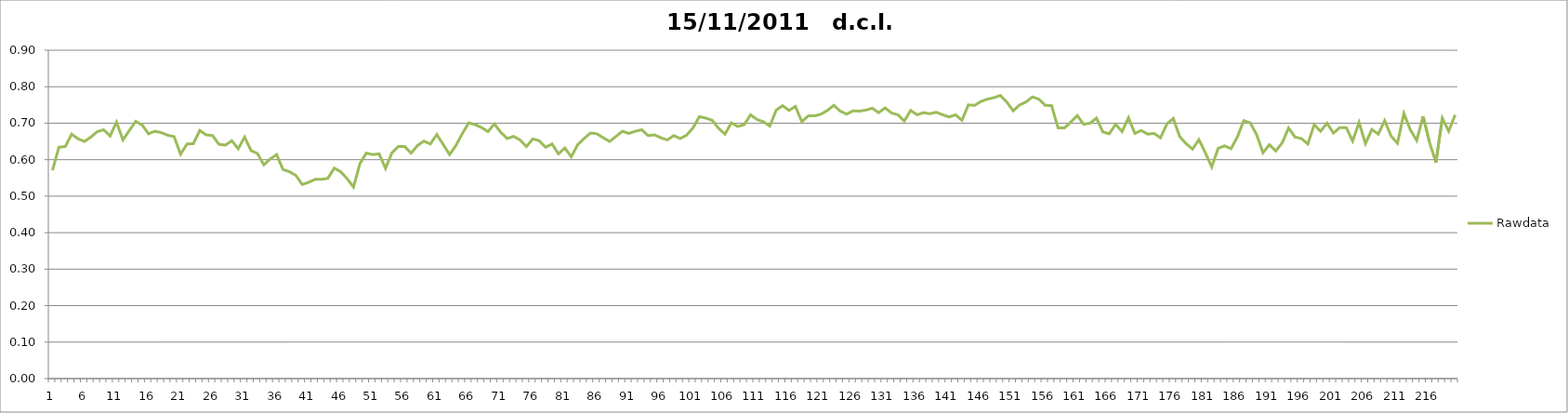
| Category | Rawdata |
|---|---|
| 0 | 0.571 |
| 1 | 0.634 |
| 2 | 0.636 |
| 3 | 0.67 |
| 4 | 0.657 |
| 5 | 0.65 |
| 6 | 0.662 |
| 7 | 0.677 |
| 8 | 0.682 |
| 9 | 0.665 |
| 10 | 0.703 |
| 11 | 0.654 |
| 12 | 0.68 |
| 13 | 0.705 |
| 14 | 0.695 |
| 15 | 0.671 |
| 16 | 0.678 |
| 17 | 0.674 |
| 18 | 0.667 |
| 19 | 0.663 |
| 20 | 0.615 |
| 21 | 0.643 |
| 22 | 0.644 |
| 23 | 0.68 |
| 24 | 0.668 |
| 25 | 0.666 |
| 26 | 0.642 |
| 27 | 0.64 |
| 28 | 0.652 |
| 29 | 0.63 |
| 30 | 0.662 |
| 31 | 0.625 |
| 32 | 0.617 |
| 33 | 0.586 |
| 34 | 0.602 |
| 35 | 0.614 |
| 36 | 0.573 |
| 37 | 0.567 |
| 38 | 0.557 |
| 39 | 0.532 |
| 40 | 0.538 |
| 41 | 0.546 |
| 42 | 0.546 |
| 43 | 0.549 |
| 44 | 0.577 |
| 45 | 0.567 |
| 46 | 0.548 |
| 47 | 0.525 |
| 48 | 0.589 |
| 49 | 0.618 |
| 50 | 0.614 |
| 51 | 0.616 |
| 52 | 0.576 |
| 53 | 0.619 |
| 54 | 0.636 |
| 55 | 0.636 |
| 56 | 0.618 |
| 57 | 0.639 |
| 58 | 0.651 |
| 59 | 0.643 |
| 60 | 0.669 |
| 61 | 0.642 |
| 62 | 0.614 |
| 63 | 0.639 |
| 64 | 0.672 |
| 65 | 0.701 |
| 66 | 0.696 |
| 67 | 0.688 |
| 68 | 0.677 |
| 69 | 0.698 |
| 70 | 0.675 |
| 71 | 0.658 |
| 72 | 0.664 |
| 73 | 0.654 |
| 74 | 0.636 |
| 75 | 0.657 |
| 76 | 0.652 |
| 77 | 0.634 |
| 78 | 0.643 |
| 79 | 0.616 |
| 80 | 0.632 |
| 81 | 0.608 |
| 82 | 0.641 |
| 83 | 0.658 |
| 84 | 0.673 |
| 85 | 0.671 |
| 86 | 0.66 |
| 87 | 0.65 |
| 88 | 0.664 |
| 89 | 0.678 |
| 90 | 0.672 |
| 91 | 0.678 |
| 92 | 0.682 |
| 93 | 0.666 |
| 94 | 0.668 |
| 95 | 0.66 |
| 96 | 0.654 |
| 97 | 0.666 |
| 98 | 0.658 |
| 99 | 0.667 |
| 100 | 0.687 |
| 101 | 0.718 |
| 102 | 0.714 |
| 103 | 0.708 |
| 104 | 0.686 |
| 105 | 0.67 |
| 106 | 0.701 |
| 107 | 0.691 |
| 108 | 0.696 |
| 109 | 0.723 |
| 110 | 0.71 |
| 111 | 0.704 |
| 112 | 0.692 |
| 113 | 0.736 |
| 114 | 0.748 |
| 115 | 0.735 |
| 116 | 0.746 |
| 117 | 0.704 |
| 118 | 0.72 |
| 119 | 0.72 |
| 120 | 0.725 |
| 121 | 0.735 |
| 122 | 0.749 |
| 123 | 0.733 |
| 124 | 0.725 |
| 125 | 0.734 |
| 126 | 0.733 |
| 127 | 0.736 |
| 128 | 0.741 |
| 129 | 0.729 |
| 130 | 0.742 |
| 131 | 0.728 |
| 132 | 0.723 |
| 133 | 0.706 |
| 134 | 0.735 |
| 135 | 0.723 |
| 136 | 0.729 |
| 137 | 0.726 |
| 138 | 0.73 |
| 139 | 0.723 |
| 140 | 0.717 |
| 141 | 0.723 |
| 142 | 0.708 |
| 143 | 0.75 |
| 144 | 0.749 |
| 145 | 0.76 |
| 146 | 0.766 |
| 147 | 0.77 |
| 148 | 0.776 |
| 149 | 0.758 |
| 150 | 0.734 |
| 151 | 0.75 |
| 152 | 0.758 |
| 153 | 0.772 |
| 154 | 0.766 |
| 155 | 0.749 |
| 156 | 0.748 |
| 157 | 0.687 |
| 158 | 0.687 |
| 159 | 0.703 |
| 160 | 0.721 |
| 161 | 0.697 |
| 162 | 0.7 |
| 163 | 0.714 |
| 164 | 0.676 |
| 165 | 0.671 |
| 166 | 0.697 |
| 167 | 0.677 |
| 168 | 0.715 |
| 169 | 0.672 |
| 170 | 0.68 |
| 171 | 0.67 |
| 172 | 0.672 |
| 173 | 0.66 |
| 174 | 0.698 |
| 175 | 0.713 |
| 176 | 0.663 |
| 177 | 0.644 |
| 178 | 0.629 |
| 179 | 0.655 |
| 180 | 0.619 |
| 181 | 0.58 |
| 182 | 0.631 |
| 183 | 0.638 |
| 184 | 0.63 |
| 185 | 0.662 |
| 186 | 0.707 |
| 187 | 0.701 |
| 188 | 0.669 |
| 189 | 0.619 |
| 190 | 0.641 |
| 191 | 0.624 |
| 192 | 0.646 |
| 193 | 0.687 |
| 194 | 0.662 |
| 195 | 0.658 |
| 196 | 0.643 |
| 197 | 0.696 |
| 198 | 0.678 |
| 199 | 0.7 |
| 200 | 0.673 |
| 201 | 0.688 |
| 202 | 0.688 |
| 203 | 0.651 |
| 204 | 0.702 |
| 205 | 0.644 |
| 206 | 0.683 |
| 207 | 0.67 |
| 208 | 0.707 |
| 209 | 0.665 |
| 210 | 0.645 |
| 211 | 0.727 |
| 212 | 0.682 |
| 213 | 0.653 |
| 214 | 0.719 |
| 215 | 0.648 |
| 216 | 0.592 |
| 217 | 0.714 |
| 218 | 0.678 |
| 219 | 0.723 |